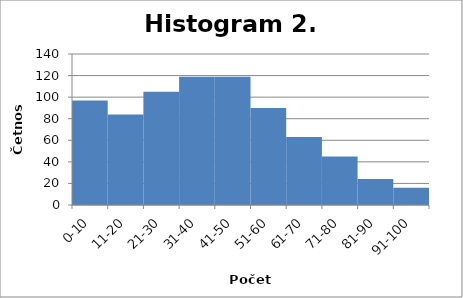
| Category | 2.PP |
|---|---|
| 0-10 | 97 |
| 11-20 | 84 |
| 21-30 | 105 |
| 31-40 | 119 |
| 41-50 | 119 |
| 51-60 | 90 |
| 61-70 | 63 |
| 71-80 | 45 |
| 81-90 | 24 |
| 91-100 | 16 |